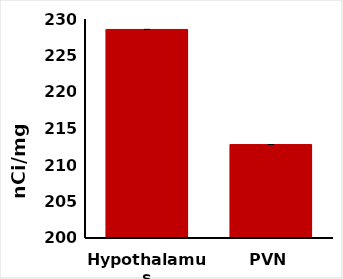
| Category | Specific Binding  |
|---|---|
| Hypothalamus | 228.569 |
| PVN | 212.803 |